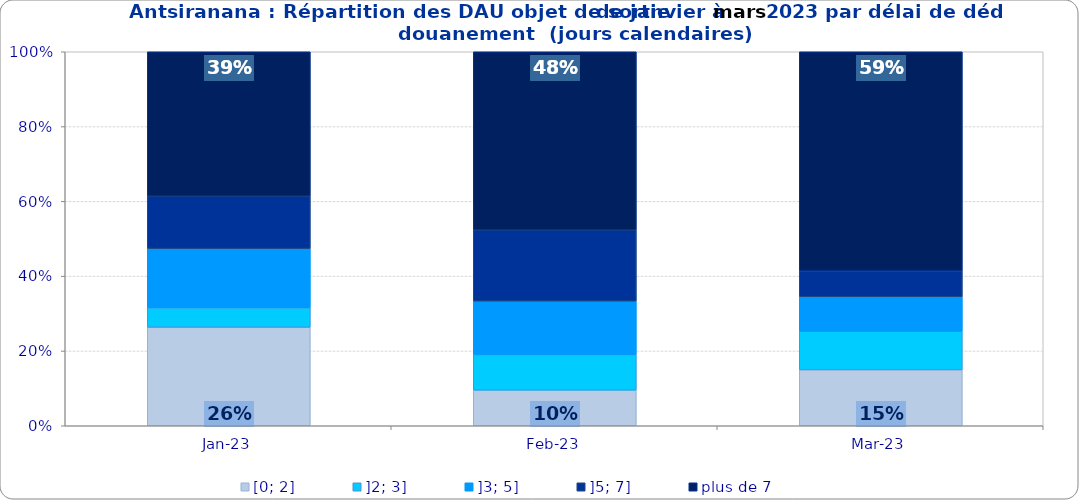
| Category | [0; 2] | ]2; 3] | ]3; 5] | ]5; 7] | plus de 7 |
|---|---|---|---|---|---|
| 2023-01-01 | 0.263 | 0.053 | 0.158 | 0.14 | 0.386 |
| 2023-02-01 | 0.095 | 0.095 | 0.143 | 0.19 | 0.476 |
| 2023-03-01 | 0.149 | 0.103 | 0.092 | 0.069 | 0.586 |